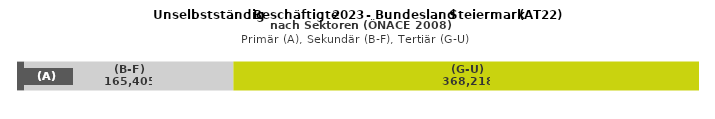
| Category | (A) | (B-F) | (G-U) |
|---|---|---|---|
| 0 | 5718 | 165405 | 368218 |